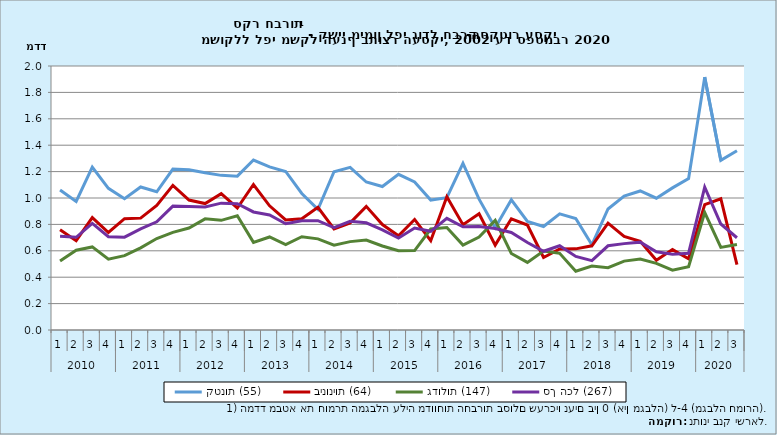
| Category | קטנות (55) | בינוניות (64) | גדולות (147) | סך הכל (267) |
|---|---|---|---|---|
| 0 | 1.061 | 0.76 | 0.522 | 0.71 |
| 1 | 0.974 | 0.677 | 0.605 | 0.702 |
| 2 | 1.235 | 0.851 | 0.629 | 0.808 |
| 3 | 1.074 | 0.739 | 0.536 | 0.707 |
| 4 | 0.995 | 0.843 | 0.563 | 0.703 |
| 5 | 1.083 | 0.847 | 0.622 | 0.766 |
| 6 | 1.047 | 0.944 | 0.693 | 0.82 |
| 7 | 1.219 | 1.096 | 0.739 | 0.939 |
| 8 | 1.213 | 0.985 | 0.773 | 0.936 |
| 9 | 1.192 | 0.958 | 0.842 | 0.933 |
| 10 | 1.172 | 1.033 | 0.831 | 0.961 |
| 11 | 1.166 | 0.924 | 0.865 | 0.957 |
| 12 | 1.287 | 1.102 | 0.664 | 0.894 |
| 13 | 1.236 | 0.941 | 0.705 | 0.871 |
| 14 | 1.201 | 0.834 | 0.648 | 0.805 |
| 15 | 1.035 | 0.842 | 0.706 | 0.828 |
| 16 | 0.914 | 0.929 | 0.69 | 0.828 |
| 17 | 1.199 | 0.766 | 0.642 | 0.775 |
| 18 | 1.232 | 0.811 | 0.67 | 0.824 |
| 19 | 1.121 | 0.937 | 0.682 | 0.812 |
| 20 | 1.087 | 0.799 | 0.636 | 0.759 |
| 21 | 1.18 | 0.714 | 0.6 | 0.696 |
| 22 | 1.122 | 0.838 | 0.601 | 0.772 |
| 23 | 0.984 | 0.677 | 0.765 | 0.748 |
| 24 | 1.003 | 1.01 | 0.776 | 0.845 |
| 25 | 1.262 | 0.798 | 0.643 | 0.782 |
| 26 | 0.991 | 0.881 | 0.704 | 0.785 |
| 27 | 0.775 | 0.643 | 0.83 | 0.768 |
| 28 | 0.986 | 0.843 | 0.58 | 0.739 |
| 29 | 0.822 | 0.795 | 0.512 | 0.663 |
| 30 | 0.784 | 0.549 | 0.598 | 0.596 |
| 31 | 0.88 | 0.613 | 0.581 | 0.638 |
| 32 | 0.845 | 0.615 | 0.445 | 0.557 |
| 33 | 0.645 | 0.638 | 0.484 | 0.526 |
| 34 | 0.917 | 0.81 | 0.472 | 0.638 |
| 35 | 1.015 | 0.709 | 0.522 | 0.654 |
| 36 | 1.053 | 0.673 | 0.538 | 0.666 |
| 37 | 0.999 | 0.529 | 0.505 | 0.593 |
| 38 | 1.077 | 0.609 | 0.453 | 0.574 |
| 39 | 1.147 | 0.54 | 0.479 | 0.582 |
| 40 | 1.916 | 0.95 | 0.89 | 1.083 |
| 41 | 1.285 | 0.995 | 0.626 | 0.803 |
| 42 | 1.358 | 0.496 | 0.647 | 0.699 |